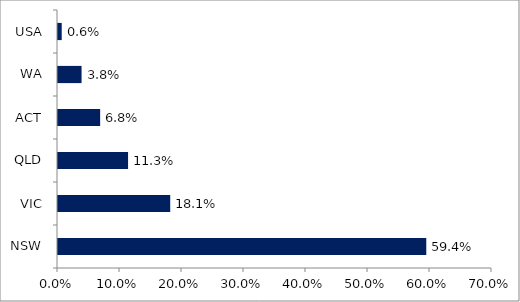
| Category | Series 0 |
|---|---|
| NSW | 0.594 |
| VIC | 0.181 |
| QLD | 0.113 |
| ACT | 0.068 |
| WA | 0.038 |
| USA | 0.006 |